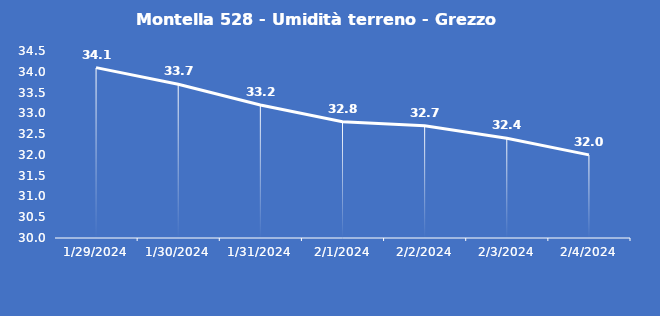
| Category | Montella 528 - Umidità terreno - Grezzo (%VWC) |
|---|---|
| 1/29/24 | 34.1 |
| 1/30/24 | 33.7 |
| 1/31/24 | 33.2 |
| 2/1/24 | 32.8 |
| 2/2/24 | 32.7 |
| 2/3/24 | 32.4 |
| 2/4/24 | 32 |